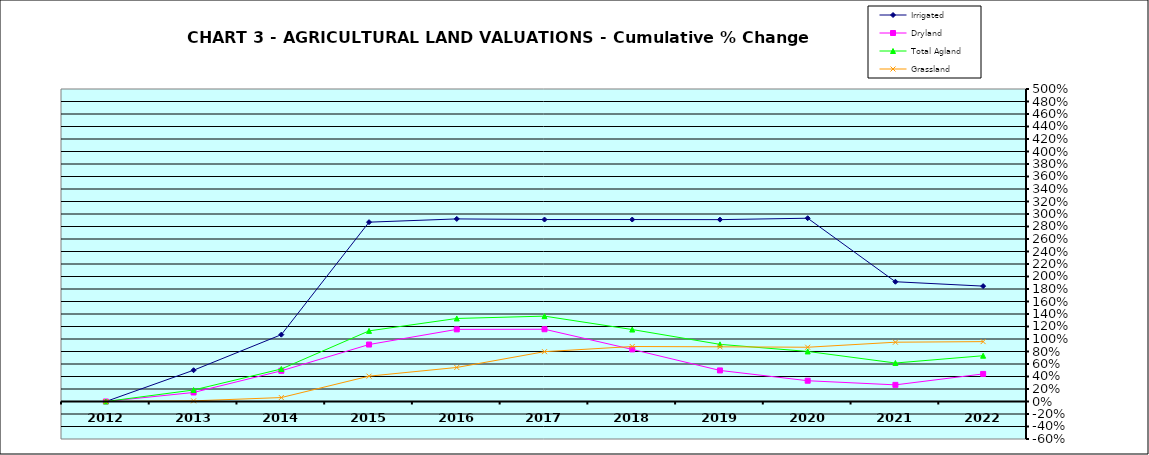
| Category | Irrigated | Dryland | Total Agland | Grassland |
|---|---|---|---|---|
| 2012.0 | 0 | 0 | 0 | 0 |
| 2013.0 | 0.5 | 0.144 | 0.184 | 0.01 |
| 2014.0 | 1.069 | 0.491 | 0.52 | 0.063 |
| 2015.0 | 2.869 | 0.911 | 1.13 | 0.405 |
| 2016.0 | 2.921 | 1.154 | 1.329 | 0.545 |
| 2017.0 | 2.911 | 1.156 | 1.366 | 0.797 |
| 2018.0 | 2.911 | 0.834 | 1.151 | 0.88 |
| 2019.0 | 2.91 | 0.497 | 0.914 | 0.875 |
| 2020.0 | 2.932 | 0.332 | 0.801 | 0.868 |
| 2021.0 | 1.916 | 0.266 | 0.616 | 0.949 |
| 2022.0 | 1.846 | 0.441 | 0.732 | 0.958 |